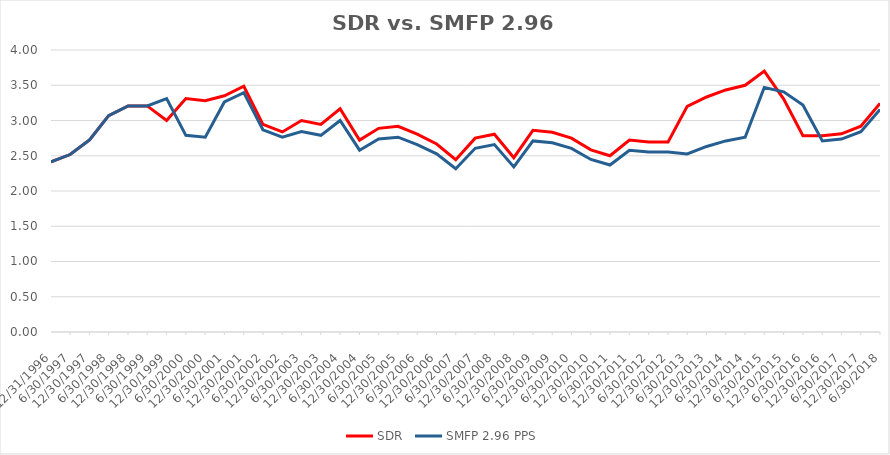
| Category | SDR | SMFP 2.96 PPS |
|---|---|---|
| 12/31/96 | 2.414 | 2.414 |
| 6/30/97 | 2.517 | 2.517 |
| 12/31/97 | 2.724 | 2.724 |
| 6/30/98 | 3.069 | 3.069 |
| 12/31/98 | 3.207 | 3.207 |
| 6/30/99 | 3.207 | 3.207 |
| 12/31/99 | 3 | 3.31 |
| 6/30/00 | 3.312 | 2.789 |
| 12/31/00 | 3.281 | 2.763 |
| 6/30/01 | 3.351 | 3.263 |
| 12/31/01 | 3.486 | 3.395 |
| 6/30/02 | 2.946 | 2.868 |
| 12/31/02 | 2.838 | 2.763 |
| 6/30/03 | 3 | 2.842 |
| 12/31/03 | 2.944 | 2.789 |
| 6/30/04 | 3.167 | 3 |
| 12/31/04 | 2.722 | 2.579 |
| 6/30/05 | 2.889 | 2.737 |
| 12/31/05 | 2.917 | 2.763 |
| 6/30/06 | 2.806 | 2.658 |
| 12/31/06 | 2.667 | 2.526 |
| 6/30/07 | 2.444 | 2.316 |
| 12/31/07 | 2.75 | 2.605 |
| 6/30/08 | 2.806 | 2.658 |
| 12/31/08 | 2.472 | 2.342 |
| 6/30/09 | 2.861 | 2.711 |
| 12/31/09 | 2.833 | 2.684 |
| 6/30/10 | 2.75 | 2.605 |
| 12/31/10 | 2.583 | 2.447 |
| 6/30/11 | 2.5 | 2.368 |
| 12/31/11 | 2.722 | 2.579 |
| 6/30/12 | 2.694 | 2.553 |
| 12/31/12 | 2.694 | 2.553 |
| 6/30/13 | 3.2 | 2.526 |
| 12/31/13 | 3.333 | 2.632 |
| 6/30/14 | 3.433 | 2.711 |
| 12/31/14 | 3.5 | 2.763 |
| 6/30/15 | 3.7 | 3.469 |
| 12/31/15 | 3.303 | 3.406 |
| 6/30/16 | 2.784 | 3.219 |
| 12/31/16 | 2.784 | 2.711 |
| 6/30/17 | 2.811 | 2.737 |
| 12/31/17 | 2.919 | 2.842 |
| 6/30/18 | 3.243 | 3.158 |